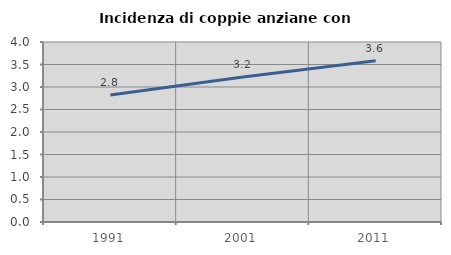
| Category | Incidenza di coppie anziane con figli |
|---|---|
| 1991.0 | 2.822 |
| 2001.0 | 3.225 |
| 2011.0 | 3.583 |